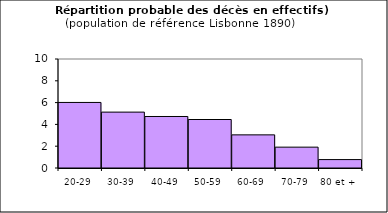
| Category | Series 0 |
|---|---|
| 20-29 | 6.015 |
| 30-39 | 5.127 |
| 40-49 | 4.726 |
| 50-59 | 4.449 |
| 60-69 | 3.04 |
| 70-79 | 1.912 |
| 80 et + | 0.771 |